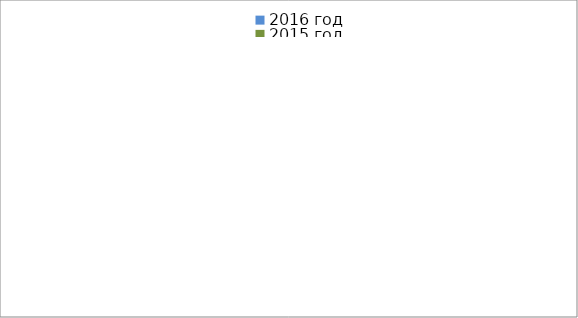
| Category | 2016 год | 2015 год |
|---|---|---|
|  - поджог | 7 | 1 |
|  - неосторожное обращение с огнём | 6 | 9 |
|  - НПТЭ электрооборудования | 0 | 1 |
|  - НПУ и Э печей | 9 | 8 |
|  - НПУ и Э транспортных средств | 6 | 11 |
|   -Шалость с огнем детей | 1 | 0 |
|  -НППБ при эксплуатации эл.приборов | 0 | 5 |
|  - курение | 0 | 2 |
| - прочие | 12 | 12 |
| - не установленные причины | 4 | 1 |